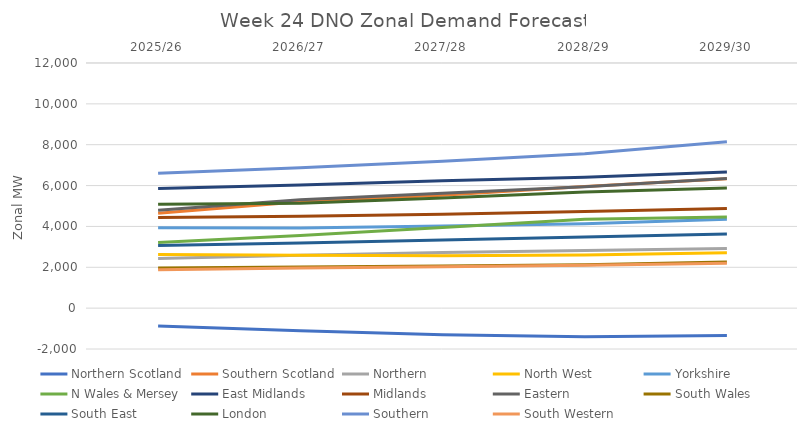
| Category | Northern Scotland | Southern Scotland | Northern | North West | Yorkshire | N Wales & Mersey | East Midlands | Midlands | Eastern | South Wales | South East | London | Southern | South Western |
|---|---|---|---|---|---|---|---|---|---|---|---|---|---|---|
| 2025/26 | -875.938 | 4649.837 | 2425.26 | 2625.45 | 3929.886 | 3214.069 | 5856.37 | 4432.935 | 4793.39 | 1970.157 | 3071 | 5083.598 | 6603.964 | 1884.369 |
| 2026/27 | -1107.627 | 5212.296 | 2589.61 | 2591.01 | 3927.956 | 3557.154 | 6025.876 | 4502.439 | 5299.985 | 2015.754 | 3192.3 | 5135.023 | 6871.817 | 1959.59 |
| 2027/28 | -1303.735 | 5527.605 | 2729.214 | 2565 | 4026.852 | 3944.938 | 6231.614 | 4594.627 | 5622.635 | 2061.783 | 3341.2 | 5394.673 | 7189.617 | 2026.294 |
| 2028/29 | -1394.717 | 5950.347 | 2827.152 | 2600.75 | 4130.488 | 4347.013 | 6410.637 | 4736.847 | 5946.835 | 2124.065 | 3486.5 | 5683.673 | 7558.786 | 2101.196 |
| 2029/30 | -1341.574 | 6330.024 | 2924.865 | 2713.336 | 4345.325 | 4457.33 | 6667.883 | 4876.839 | 6343.485 | 2255.706 | 3632 | 5878.723 | 8150.469 | 2192.976 |